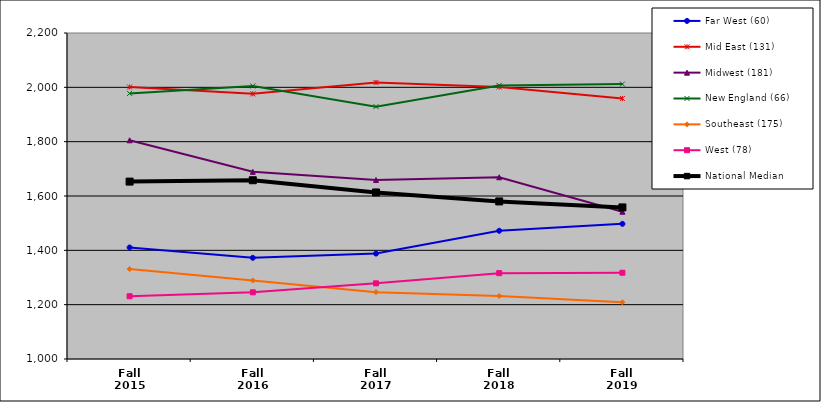
| Category | Far West (60) | Mid East (131) | Midwest (181) | New England (66) | Southeast (175) | West (78) | National Median |
|---|---|---|---|---|---|---|---|
| Fall 2015 | 1410.5 | 2001 | 1805 | 1977.5 | 1331 | 1231 | 1653 |
| Fall 2016 | 1372.5 | 1976 | 1689 | 2005 | 1289 | 1245.5 | 1658 |
| Fall 2017 | 1388 | 2018 | 1659 | 1929 | 1246 | 1278.5 | 1613 |
| Fall 2018 | 1472 | 2001 | 1669 | 2007 | 1232 | 1316 | 1580 |
| Fall 2019 | 1497.5 | 1959 | 1542 | 2012 | 1209 | 1317.5 | 1558 |